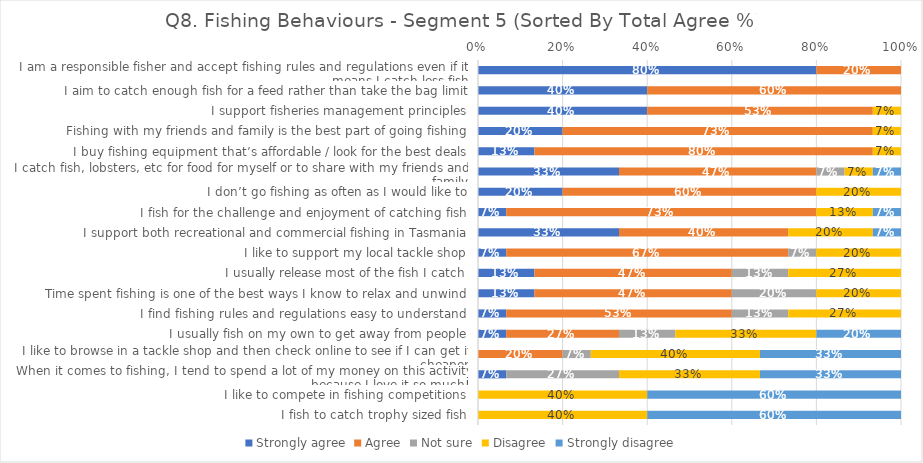
| Category | Strongly agree | Agree | Not sure | Disagree | Strongly disagree |
|---|---|---|---|---|---|
| I am a responsible fisher and accept fishing rules and regulations even if it means I catch less fish | 0.8 | 0.2 | 0 | 0 | 0 |
| I aim to catch enough fish for a feed rather than take the bag limit | 0.4 | 0.6 | 0 | 0 | 0 |
| I support fisheries management principles | 0.4 | 0.533 | 0 | 0.067 | 0 |
| Fishing with my friends and family is the best part of going fishing | 0.2 | 0.733 | 0 | 0.067 | 0 |
| I buy fishing equipment that’s affordable / look for the best deals | 0.133 | 0.8 | 0 | 0.067 | 0 |
| I catch fish, lobsters, etc for food for myself or to share with my friends and family | 0.333 | 0.467 | 0.067 | 0.067 | 0.067 |
| I don’t go fishing as often as I would like to | 0.2 | 0.6 | 0 | 0.2 | 0 |
| I fish for the challenge and enjoyment of catching fish | 0.067 | 0.733 | 0 | 0.133 | 0.067 |
| I support both recreational and commercial fishing in Tasmania | 0.333 | 0.4 | 0 | 0.2 | 0.067 |
| I like to support my local tackle shop | 0.067 | 0.667 | 0.067 | 0.2 | 0 |
| I usually release most of the fish I catch | 0.133 | 0.467 | 0.133 | 0.267 | 0 |
| Time spent fishing is one of the best ways I know to relax and unwind | 0.133 | 0.467 | 0.2 | 0.2 | 0 |
| I find fishing rules and regulations easy to understand | 0.067 | 0.533 | 0.133 | 0.267 | 0 |
| I usually fish on my own to get away from people | 0.067 | 0.267 | 0.133 | 0.333 | 0.2 |
| I like to browse in a tackle shop and then check online to see if I can get it cheaper | 0 | 0.2 | 0.067 | 0.4 | 0.333 |
| When it comes to fishing, I tend to spend a lot of my money on this activity because I love it so much! | 0.067 | 0 | 0.267 | 0.333 | 0.333 |
| I like to compete in fishing competitions | 0 | 0 | 0 | 0.4 | 0.6 |
| I fish to catch trophy sized fish | 0 | 0 | 0 | 0.4 | 0.6 |